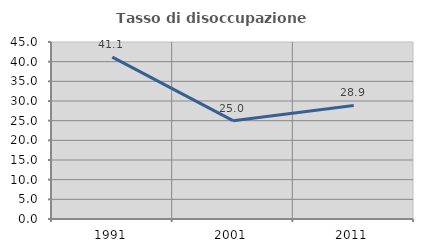
| Category | Tasso di disoccupazione giovanile  |
|---|---|
| 1991.0 | 41.141 |
| 2001.0 | 25 |
| 2011.0 | 28.859 |